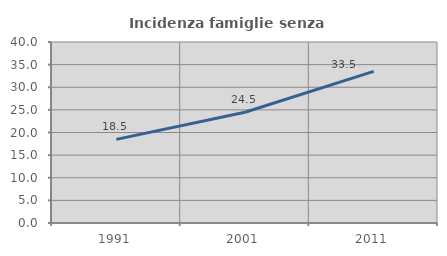
| Category | Incidenza famiglie senza nuclei |
|---|---|
| 1991.0 | 18.48 |
| 2001.0 | 24.481 |
| 2011.0 | 33.498 |